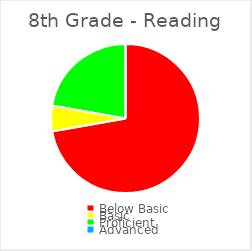
| Category | Series 0 |
|---|---|
| Below Basic | 0.722 |
| Basic | 0.056 |
| Proficient | 0.222 |
| Advanced | 0 |